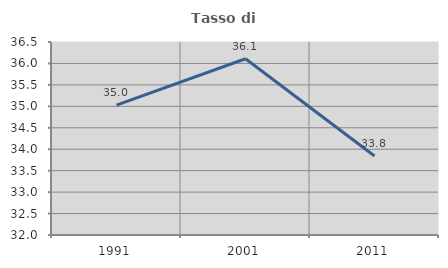
| Category | Tasso di occupazione   |
|---|---|
| 1991.0 | 35.03 |
| 2001.0 | 36.109 |
| 2011.0 | 33.844 |